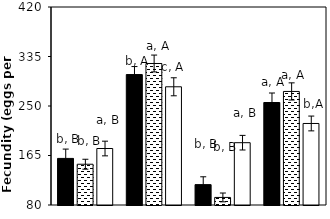
| Category | AB | AC | CK |
|---|---|---|---|
| aCO2-Bt | 160 | 150 | 177 |
| aCO2-Xy | 304 | 323 | 283 |
| eCO2-Bt | 115 | 93 | 187 |
| eCO2-Xy | 256 | 275 | 220 |